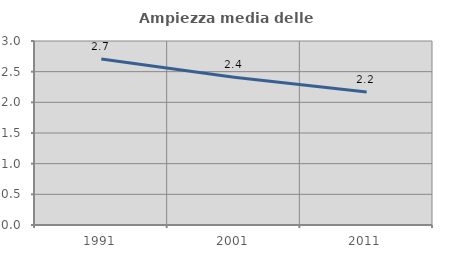
| Category | Ampiezza media delle famiglie |
|---|---|
| 1991.0 | 2.706 |
| 2001.0 | 2.41 |
| 2011.0 | 2.167 |